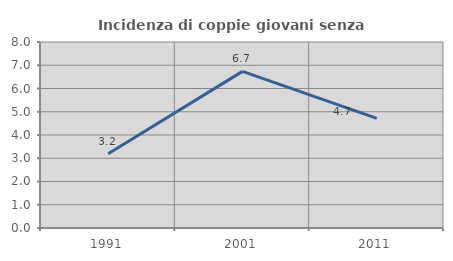
| Category | Incidenza di coppie giovani senza figli |
|---|---|
| 1991.0 | 3.191 |
| 2001.0 | 6.736 |
| 2011.0 | 4.712 |